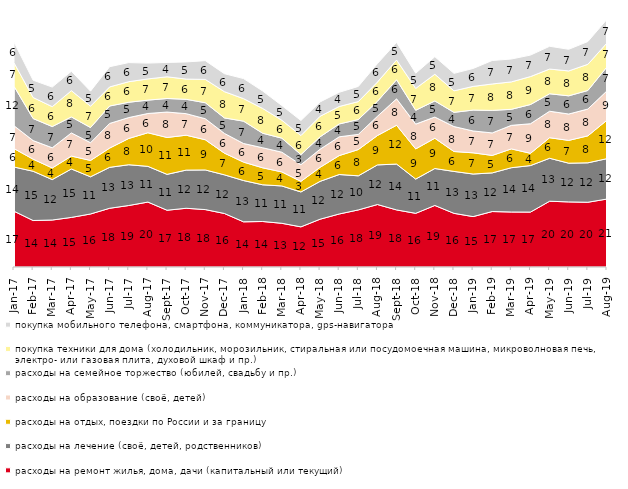
| Category | расходы на ремонт жилья, дома, дачи (капитальный или текущий) | расходы на лечение (своё, детей, родственников) | расходы на отдых, поездки по России и за границу | расходы на образование (своё, детей) | расходы на семейное торжество (юбилей, свадьбу и пр.) | покупка техники для дома (холодильник, морозильник, стиральная или посудомоечная машина, микроволновая печь, электро- или газовая плита, духовой шкаф и пр.) | покупка мобильного телефона, смартфона, коммуникатора, gps-навигатора |
|---|---|---|---|---|---|---|---|
| 2017-01-01 | 17.1 | 13.55 | 5.65 | 7 | 12.1 | 7.2 | 6.35 |
| 2017-02-01 | 14.25 | 15.1 | 3.7 | 5.7 | 6.75 | 6.45 | 5.3 |
| 2017-03-01 | 14.4 | 12.4 | 3.55 | 6.2 | 6.5 | 6.1 | 6 |
| 2017-04-01 | 15.2 | 14.85 | 3.95 | 7.1 | 4.9 | 8.05 | 5.95 |
| 2017-05-01 | 16.25 | 11.4 | 5 | 5.45 | 4.65 | 6.55 | 4.6 |
| 2017-06-01 | 18 | 12.55 | 5.9 | 7.55 | 5.35 | 5.85 | 6.2 |
| 2017-07-01 | 18.85 | 12.5 | 8.05 | 6.4 | 4.7 | 6.3 | 5.85 |
| 2017-08-01 | 19.9 | 10.95 | 10.3 | 5.9 | 4.1 | 6.5 | 4.85 |
| 2017-09-01 | 17.4 | 11 | 11.3 | 7.8 | 4.15 | 6.65 | 4.4 |
| 2017-10-01 | 18 | 11.7 | 10.7 | 6.6 | 4.4 | 6.2 | 5.25 |
| 2017-11-01 | 17.6 | 12.15 | 9.25 | 6.45 | 4.9 | 7.15 | 5.75 |
| 2017-12-01 | 16.4 | 11.85 | 6.65 | 6.05 | 4.75 | 8.05 | 5.5 |
| 2018-01-01 | 13.85 | 12.65 | 5.65 | 5.7 | 6.85 | 6.9 | 6.15 |
| 2018-02-01 | 13.95 | 11.25 | 5.2 | 6.15 | 4.45 | 7.6 | 5.35 |
| 2018-03-01 | 13.4 | 11.45 | 4.3 | 6.05 | 4.3 | 5.5 | 4.5 |
| 2018-04-01 | 12.3 | 10.7 | 3.25 | 5.1 | 3.1 | 5.85 | 4.6 |
| 2018-05-01 | 14.65 | 11.6 | 4.3 | 5.55 | 3.8 | 6.3 | 4.4 |
| 2018-06-01 | 16.25 | 12.1 | 5.8 | 5.75 | 3.95 | 5.35 | 4.35 |
| 2018-07-01 | 17.5 | 10.45 | 8.05 | 4.65 | 4.55 | 5.5 | 4.65 |
| 2018-08-01 | 19.15 | 12.15 | 9 | 5.9 | 4.6 | 5.9 | 5.65 |
| 2018-09-01 | 17.5 | 14.05 | 11.9 | 8.1 | 5.85 | 6.05 | 5.4 |
| 2018-10-01 | 16.45 | 10.5 | 9.25 | 7.6 | 4.25 | 6.7 | 4.65 |
| 2018-11-01 | 18.862 | 11.327 | 9.281 | 6.487 | 4.94 | 8.184 | 5.389 |
| 2018-12-01 | 16.45 | 12.85 | 6.1 | 7.65 | 4.35 | 6.6 | 5.35 |
| 2019-01-01 | 15.45 | 13.05 | 6.5 | 6.7 | 6.4 | 7.25 | 5.5 |
| 2019-02-01 | 17 | 11.85 | 5.35 | 6.9 | 6.9 | 8.1 | 7.2 |
| 2019-03-01 | 16.857 | 13.575 | 5.768 | 7.21 | 4.923 | 8.404 | 7.011 |
| 2019-04-01 | 16.832 | 14.257 | 3.762 | 9.059 | 5.891 | 8.564 | 6.584 |
| 2019-05-01 | 20.158 | 13.175 | 6.29 | 8.123 | 5.349 | 7.578 | 6.984 |
| 2019-06-01 | 19.95 | 11.87 | 6.983 | 8.08 | 5.586 | 7.631 | 6.633 |
| 2019-07-01 | 19.851 | 12.079 | 8.267 | 8.218 | 5.693 | 8.02 | 6.98 |
| 2019-08-01 | 20.829 | 12.388 | 11.788 | 8.991 | 7.343 | 7.343 | 7.243 |